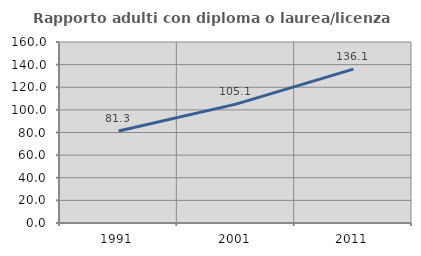
| Category | Rapporto adulti con diploma o laurea/licenza media  |
|---|---|
| 1991.0 | 81.311 |
| 2001.0 | 105.068 |
| 2011.0 | 136.064 |